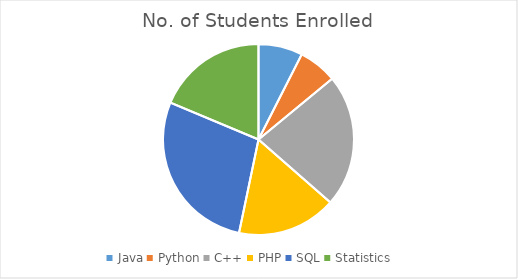
| Category | No. of Students Enrolled |
|---|---|
| Java | 40 |
| Python | 35 |
| C++ | 120 |
| PHP | 90 |
| SQL | 150 |
| Statistics | 100 |